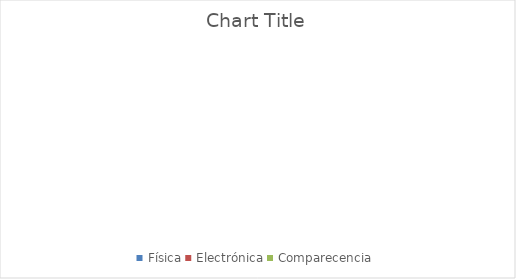
| Category | Series 0 |
|---|---|
| Física | 0 |
| Electrónica | 0 |
| Comparecencia | 0 |